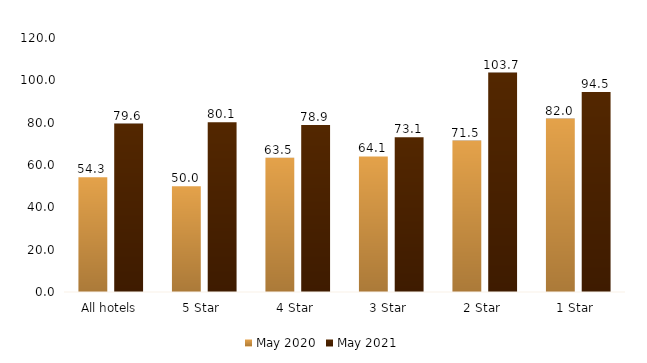
| Category | May 2020 | May 2021 |
|---|---|---|
| All hotels | 54.269 | 79.585 |
| 5 Star  | 49.968 | 80.144 |
| 4 Star  | 63.476 | 78.895 |
| 3 Star  | 64.059 | 73.146 |
| 2 Star  | 71.524 | 103.674 |
| 1 Star  | 81.956 | 94.537 |